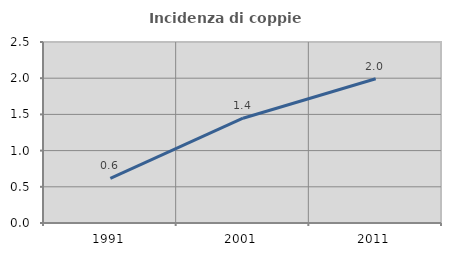
| Category | Incidenza di coppie miste |
|---|---|
| 1991.0 | 0.615 |
| 2001.0 | 1.448 |
| 2011.0 | 1.992 |